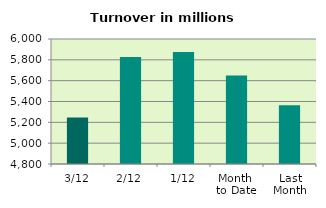
| Category | Series 0 |
|---|---|
| 3/12 | 5246.111 |
| 2/12 | 5827.512 |
| 1/12 | 5875.461 |
| Month 
to Date | 5649.694 |
| Last
Month | 5362.851 |